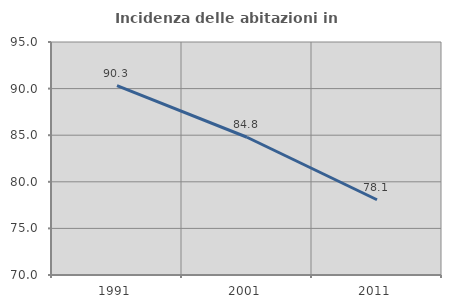
| Category | Incidenza delle abitazioni in proprietà  |
|---|---|
| 1991.0 | 90.318 |
| 2001.0 | 84.779 |
| 2011.0 | 78.076 |